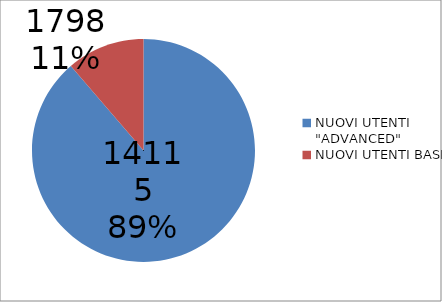
| Category | Series 0 |
|---|---|
| NUOVI UTENTI "ADVANCED"  | 14115 |
| NUOVI UTENTI BASIC  | 1798 |